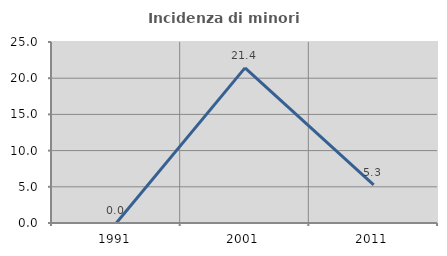
| Category | Incidenza di minori stranieri |
|---|---|
| 1991.0 | 0 |
| 2001.0 | 21.429 |
| 2011.0 | 5.263 |